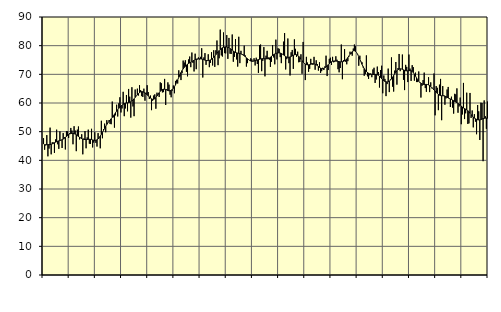
| Category | Piggar | Series 1 |
|---|---|---|
| nan | 47.7 | 45.73 |
| 87.0 | 43.7 | 45.44 |
| 87.0 | 45.2 | 45.48 |
| 87.0 | 48.8 | 45.49 |
| 87.0 | 41.4 | 45.47 |
| 87.0 | 44.1 | 45.47 |
| 87.0 | 51.4 | 45.5 |
| 87.0 | 42.1 | 45.61 |
| 87.0 | 46.3 | 45.75 |
| 87.0 | 46.2 | 45.92 |
| 87.0 | 42.6 | 46.13 |
| 87.0 | 47.3 | 46.33 |
| nan | 50.7 | 46.51 |
| 88.0 | 45.6 | 46.66 |
| 88.0 | 44 | 46.79 |
| 88.0 | 50.1 | 46.9 |
| 88.0 | 47.1 | 47.03 |
| 88.0 | 44.3 | 47.21 |
| 88.0 | 49.5 | 47.41 |
| 88.0 | 48.1 | 47.67 |
| 88.0 | 43.8 | 48 |
| 88.0 | 50.2 | 48.34 |
| 88.0 | 50.1 | 48.68 |
| 88.0 | 47.8 | 48.98 |
| nan | 49.5 | 49.19 |
| 89.0 | 51.3 | 49.33 |
| 89.0 | 50.4 | 49.42 |
| 89.0 | 45.6 | 49.42 |
| 89.0 | 51.9 | 49.32 |
| 89.0 | 50.4 | 49.15 |
| 89.0 | 43.2 | 48.9 |
| 89.0 | 50.7 | 48.61 |
| 89.0 | 51.8 | 48.32 |
| 89.0 | 47.3 | 48.03 |
| 89.0 | 47.9 | 47.77 |
| 89.0 | 49.1 | 47.57 |
| nan | 42.1 | 47.41 |
| 90.0 | 47.6 | 47.31 |
| 90.0 | 50.2 | 47.26 |
| 90.0 | 44.2 | 47.26 |
| 90.0 | 48 | 47.29 |
| 90.0 | 50.7 | 47.32 |
| 90.0 | 45.8 | 47.34 |
| 90.0 | 45.7 | 47.33 |
| 90.0 | 51 | 47.25 |
| 90.0 | 44.5 | 47.12 |
| 90.0 | 46.2 | 47.01 |
| 90.0 | 49.8 | 46.94 |
| nan | 46.1 | 46.99 |
| 91.0 | 44.8 | 47.16 |
| 91.0 | 49.5 | 47.47 |
| 91.0 | 47.7 | 47.91 |
| 91.0 | 44.2 | 48.46 |
| 91.0 | 53.8 | 49.06 |
| 91.0 | 47.7 | 49.73 |
| 91.0 | 50.9 | 50.46 |
| 91.0 | 52.8 | 51.18 |
| 91.0 | 49.8 | 51.87 |
| 91.0 | 54 | 52.52 |
| 91.0 | 53 | 53.08 |
| nan | 54 | 53.57 |
| 92.0 | 52.7 | 54.05 |
| 92.0 | 52.6 | 54.5 |
| 92.0 | 60.5 | 54.97 |
| 92.0 | 55 | 55.5 |
| 92.0 | 51.4 | 56.05 |
| 92.0 | 55.7 | 56.62 |
| 92.0 | 59.4 | 57.16 |
| 92.0 | 55.3 | 57.66 |
| 92.0 | 59.9 | 58.13 |
| 92.0 | 62 | 58.55 |
| 92.0 | 56.7 | 58.92 |
| nan | 58.1 | 59.26 |
| 93.0 | 63.9 | 59.56 |
| 93.0 | 55.4 | 59.79 |
| 93.0 | 58.1 | 59.93 |
| 93.0 | 62.8 | 60 |
| 93.0 | 57.1 | 60.05 |
| 93.0 | 64.9 | 60.12 |
| 93.0 | 62.2 | 60.23 |
| 93.0 | 54.9 | 60.42 |
| 93.0 | 65.5 | 60.69 |
| 93.0 | 58.8 | 61.04 |
| 93.0 | 55.4 | 61.46 |
| nan | 64.7 | 61.94 |
| 94.0 | 62.4 | 62.41 |
| 94.0 | 65 | 62.85 |
| 94.0 | 62.6 | 63.27 |
| 94.0 | 66.2 | 63.62 |
| 94.0 | 64.5 | 63.87 |
| 94.0 | 62.4 | 63.98 |
| 94.0 | 62.1 | 63.93 |
| 94.0 | 65 | 63.76 |
| 94.0 | 60.8 | 63.52 |
| 94.0 | 63.6 | 63.19 |
| 94.0 | 66.2 | 62.85 |
| nan | 63.8 | 62.48 |
| 95.0 | 61.4 | 62.09 |
| 95.0 | 62.6 | 61.73 |
| 95.0 | 57.5 | 61.45 |
| 95.0 | 60.8 | 61.29 |
| 95.0 | 62.6 | 61.3 |
| 95.0 | 63 | 61.52 |
| 95.0 | 58 | 61.92 |
| 95.0 | 63.6 | 62.44 |
| 95.0 | 63.2 | 63 |
| 95.0 | 62.1 | 63.58 |
| 95.0 | 67.2 | 64.08 |
| nan | 66.9 | 64.46 |
| 96.0 | 63.7 | 64.7 |
| 96.0 | 63.8 | 64.81 |
| 96.0 | 68.4 | 64.8 |
| 96.0 | 59.3 | 64.7 |
| 96.0 | 64.8 | 64.53 |
| 96.0 | 67.2 | 64.35 |
| 96.0 | 66.4 | 64.25 |
| 96.0 | 62.9 | 64.28 |
| 96.0 | 62 | 64.43 |
| 96.0 | 64.3 | 64.72 |
| 96.0 | 66.1 | 65.12 |
| nan | 63.4 | 65.65 |
| 97.0 | 67.7 | 66.35 |
| 97.0 | 68.1 | 67.17 |
| 97.0 | 66.8 | 68.06 |
| 97.0 | 71.4 | 68.97 |
| 97.0 | 69.3 | 69.84 |
| 97.0 | 68 | 70.62 |
| 97.0 | 70.4 | 71.31 |
| 97.0 | 74.8 | 71.9 |
| 97.0 | 74.1 | 72.41 |
| 97.0 | 74.9 | 72.86 |
| 97.0 | 70.9 | 73.22 |
| nan | 69.3 | 73.53 |
| 98.0 | 75.2 | 73.79 |
| 98.0 | 76.2 | 74 |
| 98.0 | 72.5 | 74.22 |
| 98.0 | 77.6 | 74.45 |
| 98.0 | 74 | 74.67 |
| 98.0 | 71 | 74.91 |
| 98.0 | 77.2 | 75.13 |
| 98.0 | 71.8 | 75.29 |
| 98.0 | 75.2 | 75.38 |
| 98.0 | 75.9 | 75.41 |
| 98.0 | 75.2 | 75.41 |
| nan | 76.1 | 75.39 |
| 99.0 | 79.1 | 75.33 |
| 99.0 | 68.9 | 75.23 |
| 99.0 | 75.9 | 75.1 |
| 99.0 | 77.4 | 74.96 |
| 99.0 | 73.3 | 74.83 |
| 99.0 | 74.9 | 74.78 |
| 99.0 | 77 | 74.8 |
| 99.0 | 72.5 | 74.87 |
| 99.0 | 74 | 75.03 |
| 99.0 | 77.7 | 75.26 |
| 99.0 | 73.1 | 75.57 |
| nan | 78.4 | 75.95 |
| 0.0 | 72.6 | 76.37 |
| 0.0 | 78.4 | 76.85 |
| 0.0 | 81.8 | 77.36 |
| 0.0 | 73.2 | 77.85 |
| 0.0 | 75.6 | 78.31 |
| 0.0 | 85.6 | 78.7 |
| 0.0 | 76.6 | 79.02 |
| 0.0 | 76.2 | 79.27 |
| 0.0 | 84.6 | 79.45 |
| 0.0 | 77.4 | 79.55 |
| 0.0 | 77.3 | 79.58 |
| nan | 83.7 | 79.54 |
| 1.0 | 75.4 | 79.43 |
| 1.0 | 82.7 | 79.26 |
| 1.0 | 77.2 | 79.01 |
| 1.0 | 77.1 | 78.73 |
| 1.0 | 83.9 | 78.44 |
| 1.0 | 74.4 | 78.13 |
| 1.0 | 76.1 | 77.84 |
| 1.0 | 82.3 | 77.63 |
| 1.0 | 75.2 | 77.5 |
| 1.0 | 72.7 | 77.4 |
| 1.0 | 83.1 | 77.34 |
| nan | 73.9 | 77.27 |
| 2.0 | 78.2 | 77.14 |
| 2.0 | 76.9 | 76.97 |
| 2.0 | 76.9 | 76.73 |
| 2.0 | 80 | 76.44 |
| 2.0 | 76.6 | 76.1 |
| 2.0 | 72.7 | 75.76 |
| 2.0 | 73.9 | 75.45 |
| 2.0 | 75.2 | 75.12 |
| 2.0 | 74.8 | 74.84 |
| 2.0 | 75.6 | 74.65 |
| 2.0 | 75.2 | 74.55 |
| nan | 74.5 | 74.55 |
| 3.0 | 75.6 | 74.64 |
| 3.0 | 73.1 | 74.77 |
| 3.0 | 75.8 | 74.91 |
| 3.0 | 73.6 | 75.02 |
| 3.0 | 70.5 | 75.14 |
| 3.0 | 80.2 | 75.26 |
| 3.0 | 80.4 | 75.37 |
| 3.0 | 71.1 | 75.43 |
| 3.0 | 74.7 | 75.47 |
| 3.0 | 79.5 | 75.47 |
| 3.0 | 69.3 | 75.44 |
| nan | 76.5 | 75.41 |
| 4.0 | 78.2 | 75.41 |
| 4.0 | 75.9 | 75.48 |
| 4.0 | 75.1 | 75.67 |
| 4.0 | 72.6 | 75.95 |
| 4.0 | 74.4 | 76.27 |
| 4.0 | 80.2 | 76.59 |
| 4.0 | 75.9 | 76.86 |
| 4.0 | 73.5 | 77.11 |
| 4.0 | 82.1 | 77.3 |
| 4.0 | 75.2 | 77.42 |
| 4.0 | 79.1 | 77.48 |
| nan | 78.9 | 77.5 |
| 5.0 | 76 | 77.43 |
| 5.0 | 73.9 | 77.27 |
| 5.0 | 77 | 77.05 |
| 5.0 | 81.4 | 76.78 |
| 5.0 | 84.4 | 76.5 |
| 5.0 | 71.7 | 76.22 |
| 5.0 | 75.3 | 76 |
| 5.0 | 82.5 | 75.91 |
| 5.0 | 73.9 | 75.94 |
| 5.0 | 69.6 | 76.06 |
| 5.0 | 77.7 | 76.25 |
| nan | 78.5 | 76.44 |
| 6.0 | 71.9 | 76.65 |
| 6.0 | 82.2 | 76.82 |
| 6.0 | 78.9 | 76.9 |
| 6.0 | 76.1 | 76.84 |
| 6.0 | 77.9 | 76.63 |
| 6.0 | 74.2 | 76.29 |
| 6.0 | 74.3 | 75.84 |
| 6.0 | 77 | 75.31 |
| 6.0 | 70.2 | 74.75 |
| 6.0 | 81.3 | 74.25 |
| 6.0 | 73.9 | 73.86 |
| nan | 68 | 73.57 |
| 7.0 | 76.1 | 73.39 |
| 7.0 | 74.1 | 73.32 |
| 7.0 | 70.9 | 73.32 |
| 7.0 | 71.9 | 73.38 |
| 7.0 | 75.4 | 73.49 |
| 7.0 | 73.9 | 73.6 |
| 7.0 | 73.3 | 73.69 |
| 7.0 | 76.1 | 73.67 |
| 7.0 | 71.6 | 73.56 |
| 7.0 | 74.9 | 73.35 |
| 7.0 | 73.6 | 73.05 |
| nan | 71.3 | 72.72 |
| 8.0 | 74.2 | 72.42 |
| 8.0 | 70.5 | 72.15 |
| 8.0 | 71.1 | 71.98 |
| 8.0 | 72.3 | 71.96 |
| 8.0 | 71.5 | 72.07 |
| 8.0 | 72.8 | 72.29 |
| 8.0 | 76.5 | 72.6 |
| 8.0 | 69.4 | 72.98 |
| 8.0 | 71.5 | 73.38 |
| 8.0 | 75.4 | 73.76 |
| 8.0 | 75.8 | 74.1 |
| nan | 73.3 | 74.38 |
| 9.0 | 76.1 | 74.57 |
| 9.0 | 74.2 | 74.65 |
| 9.0 | 74.4 | 74.67 |
| 9.0 | 76.3 | 74.64 |
| 9.0 | 75.1 | 74.59 |
| 9.0 | 71.8 | 74.51 |
| 9.0 | 70.7 | 74.42 |
| 9.0 | 72.2 | 74.36 |
| 9.0 | 80.4 | 74.37 |
| 9.0 | 68.3 | 74.42 |
| 9.0 | 75 | 74.52 |
| nan | 78.8 | 74.69 |
| 10.0 | 74.4 | 74.96 |
| 10.0 | 73.5 | 75.35 |
| 10.0 | 74.6 | 75.86 |
| 10.0 | 76.2 | 76.42 |
| 10.0 | 77.9 | 76.99 |
| 10.0 | 77.1 | 77.5 |
| 10.0 | 76.5 | 77.92 |
| 10.0 | 79 | 78.19 |
| 10.0 | 80.4 | 78.24 |
| 10.0 | 79.8 | 78.03 |
| 10.0 | 77.6 | 77.6 |
| nan | 77.1 | 76.96 |
| 11.0 | 73 | 76.16 |
| 11.0 | 76.5 | 75.28 |
| 11.0 | 74.5 | 74.38 |
| 11.0 | 74.2 | 73.5 |
| 11.0 | 72.4 | 72.7 |
| 11.0 | 69.5 | 72.01 |
| 11.0 | 70.1 | 71.45 |
| 11.0 | 76.6 | 70.99 |
| 11.0 | 69.3 | 70.64 |
| 11.0 | 68.4 | 70.37 |
| 11.0 | 69.7 | 70.15 |
| nan | 70.3 | 70.02 |
| 12.0 | 69 | 69.96 |
| 12.0 | 71.7 | 69.94 |
| 12.0 | 72.3 | 69.96 |
| 12.0 | 67 | 69.98 |
| 12.0 | 68.2 | 69.94 |
| 12.0 | 72.7 | 69.85 |
| 12.0 | 70.8 | 69.67 |
| 12.0 | 65.4 | 69.35 |
| 12.0 | 71.5 | 68.92 |
| 12.0 | 73 | 68.49 |
| 12.0 | 63.4 | 68.11 |
| nan | 69.6 | 67.78 |
| 13.0 | 68.4 | 67.53 |
| 13.0 | 62.4 | 67.39 |
| 13.0 | 66.6 | 67.35 |
| 13.0 | 72 | 67.42 |
| 13.0 | 63.8 | 67.64 |
| 13.0 | 68.2 | 67.96 |
| 13.0 | 75.9 | 68.39 |
| 13.0 | 65.7 | 68.95 |
| 13.0 | 64 | 69.59 |
| 13.0 | 71.3 | 70.21 |
| 13.0 | 74.3 | 70.79 |
| nan | 66.4 | 71.28 |
| 14.0 | 72.2 | 71.62 |
| 14.0 | 77.1 | 71.84 |
| 14.0 | 71.1 | 71.93 |
| 14.0 | 71.9 | 71.88 |
| 14.0 | 76.9 | 71.74 |
| 14.0 | 68.1 | 71.56 |
| 14.0 | 64.5 | 71.38 |
| 14.0 | 73.3 | 71.25 |
| 14.0 | 72.6 | 71.21 |
| 14.0 | 67.3 | 71.23 |
| 14.0 | 76.9 | 71.27 |
| nan | 72 | 71.31 |
| 15.0 | 67.7 | 71.26 |
| 15.0 | 73.2 | 71.04 |
| 15.0 | 72.5 | 70.62 |
| 15.0 | 67.8 | 70.06 |
| 15.0 | 70.6 | 69.41 |
| 15.0 | 67.3 | 68.72 |
| 15.0 | 67.3 | 68.11 |
| 15.0 | 71 | 67.6 |
| 15.0 | 67 | 67.18 |
| 15.0 | 61.9 | 66.87 |
| 15.0 | 66 | 66.65 |
| nan | 68 | 66.52 |
| 16.0 | 70.6 | 66.48 |
| 16.0 | 65.2 | 66.48 |
| 16.0 | 63.9 | 66.48 |
| 16.0 | 66.5 | 66.44 |
| 16.0 | 69 | 66.3 |
| 16.0 | 63.8 | 66.08 |
| 16.0 | 67.2 | 65.78 |
| 16.0 | 65.1 | 65.4 |
| 16.0 | 65 | 64.98 |
| 16.0 | 70.3 | 64.57 |
| 16.0 | 55.7 | 64.18 |
| nan | 65.9 | 63.76 |
| 17.0 | 65.3 | 63.35 |
| 17.0 | 57.5 | 62.99 |
| 17.0 | 66.4 | 62.73 |
| 17.0 | 68.4 | 62.58 |
| 17.0 | 54 | 62.53 |
| 17.0 | 65.9 | 62.52 |
| 17.0 | 62.7 | 62.5 |
| 17.0 | 59.4 | 62.4 |
| 17.0 | 61.6 | 62.23 |
| 17.0 | 64.7 | 62.01 |
| 17.0 | 65.6 | 61.77 |
| nan | 61.7 | 61.58 |
| 18.0 | 58.6 | 61.41 |
| 18.0 | 62.2 | 61.23 |
| 18.0 | 58.4 | 61.04 |
| 18.0 | 56.3 | 60.81 |
| 18.0 | 63.2 | 60.56 |
| 18.0 | 63 | 60.32 |
| 18.0 | 65.1 | 60.1 |
| 18.0 | 56.6 | 59.86 |
| 18.0 | 58.8 | 59.6 |
| 18.0 | 61.9 | 59.28 |
| 18.0 | 52.6 | 58.93 |
| nan | 56 | 58.58 |
| 19.0 | 67 | 58.27 |
| 19.0 | 54.4 | 58.04 |
| 19.0 | 56.4 | 57.84 |
| 19.0 | 63.6 | 57.61 |
| 19.0 | 52.7 | 57.34 |
| 19.0 | 52.9 | 56.96 |
| 19.0 | 63.5 | 56.45 |
| 19.0 | 54.8 | 55.94 |
| 19.0 | 57.4 | 55.47 |
| 19.0 | 51.5 | 55.06 |
| 19.0 | 56.1 | 54.74 |
| nan | 53.5 | 54.49 |
| 20.0 | 49.1 | 54.29 |
| 20.0 | 59.3 | 54.14 |
| 20.0 | 57.1 | 54.09 |
| 20.0 | 47.1 | 54.12 |
| 20.0 | 60.1 | 54.22 |
| 20.0 | 60 | 54.38 |
| 20.0 | 39.7 | 54.55 |
| 20.0 | 60.9 | 54.66 |
| 20.0 | 55.4 | 54.72 |
| 20.0 | 51 | 54.72 |
| 20.0 | 60.5 | 54.63 |